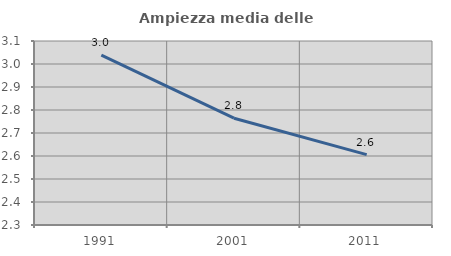
| Category | Ampiezza media delle famiglie |
|---|---|
| 1991.0 | 3.039 |
| 2001.0 | 2.764 |
| 2011.0 | 2.606 |